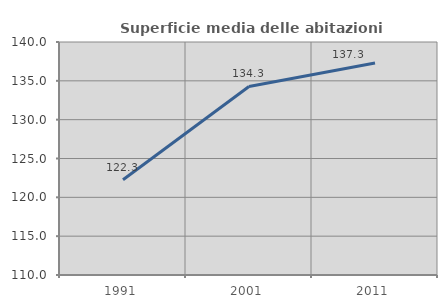
| Category | Superficie media delle abitazioni occupate |
|---|---|
| 1991.0 | 122.26 |
| 2001.0 | 134.276 |
| 2011.0 | 137.308 |